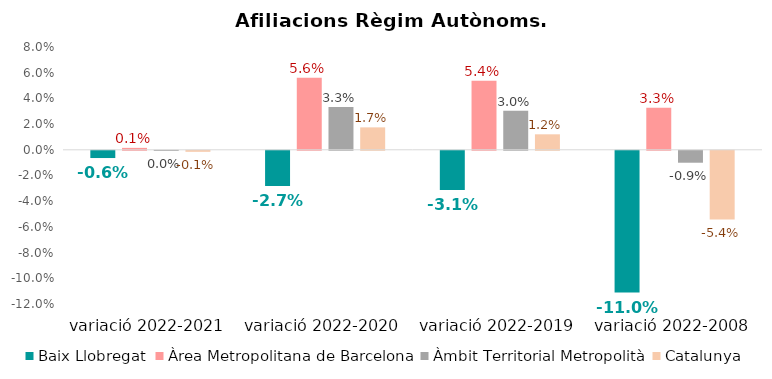
| Category | Baix Llobregat | Àrea Metropolitana de Barcelona | Àmbit Territorial Metropolità | Catalunya |
|---|---|---|---|---|
| variació 2022-2021 | -0.006 | 0.001 | 0 | -0.001 |
| variació 2022-2020 | -0.027 | 0.056 | 0.033 | 0.017 |
| variació 2022-2019 | -0.031 | 0.054 | 0.03 | 0.012 |
| variació 2022-2008 | -0.11 | 0.033 | -0.009 | -0.054 |